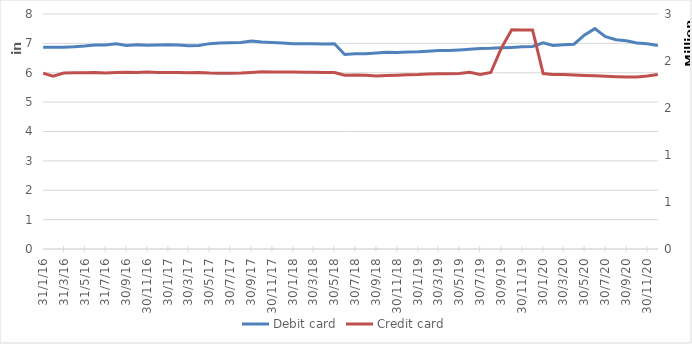
| Category | Debit card |
|---|---|
| 2016-01-31 | 6871715 |
| 2016-02-29 | 6863998 |
| 2016-03-31 | 6868674 |
| 2016-04-30 | 6881735 |
| 2016-05-31 | 6906936 |
| 2016-06-30 | 6943474 |
| 2016-07-31 | 6945024 |
| 2016-08-31 | 6988808 |
| 2016-09-30 | 6931731 |
| 2016-10-31 | 6951022 |
| 2016-11-30 | 6935749 |
| 2016-12-31 | 6944246 |
| 2017-01-31 | 6955287 |
| 2017-02-28 | 6943938 |
| 2017-03-31 | 6919607 |
| 2017-04-30 | 6927449 |
| 2017-05-31 | 6990988 |
| 2017-06-30 | 7009774 |
| 2017-07-31 | 7020284 |
| 2017-08-31 | 7027351 |
| 2017-09-30 | 7078014 |
| 2017-10-31 | 7046614 |
| 2017-11-30 | 7030070 |
| 2017-12-31 | 7012090 |
| 2018-01-31 | 6989500 |
| 2018-02-28 | 6986527 |
| 2018-03-31 | 6985426 |
| 2018-04-30 | 6980244 |
| 2018-05-31 | 6989572 |
| 2018-06-30 | 6622370 |
| 2018-07-31 | 6643303 |
| 2018-08-31 | 6645377 |
| 2018-09-30 | 6673293 |
| 2018-10-31 | 6693959 |
| 2018-11-30 | 6685787 |
| 2018-12-31 | 6704952 |
| 2019-01-31 | 6710856 |
| 2019-02-28 | 6731559 |
| 2019-03-31 | 6755640 |
| 2019-04-30 | 6754844 |
| 2019-05-31 | 6777832 |
| 2019-06-30 | 6797480 |
| 2019-07-31 | 6824152 |
| 2019-08-31 | 6833379 |
| 2019-09-30 | 6851986 |
| 2019-10-31 | 6863796 |
| 2019-11-30 | 6882850 |
| 2019-12-31 | 6895963 |
| 2020-01-31 | 7016106 |
| 2020-02-29 | 6926212 |
| 2020-03-31 | 6955094 |
| 2020-04-30 | 6972105 |
| 2020-05-31 | 7290216 |
| 2020-06-30 | 7501215 |
| 2020-07-31 | 7229451 |
| 2020-08-31 | 7124170 |
| 2020-09-30 | 7087848 |
| 2020-10-31 | 7015507 |
| 2020-11-30 | 6990201 |
| 2020-12-31 | 6924530 |